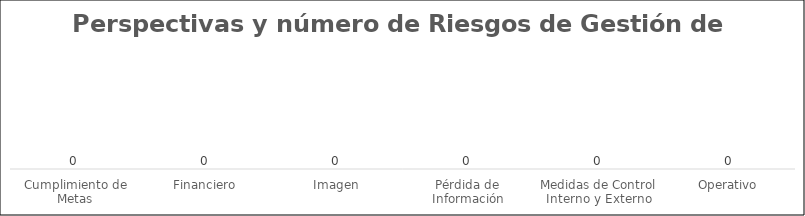
| Category | Series 0 |
|---|---|
| Cumplimiento de Metas | 0 |
| Financiero | 0 |
| Imagen | 0 |
| Pérdida de Información | 0 |
| Medidas de Control Interno y Externo | 0 |
| Operativo | 0 |